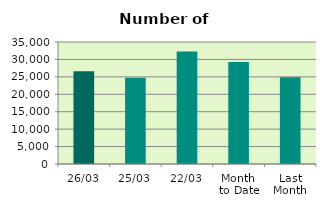
| Category | Series 0 |
|---|---|
| 26/03 | 26638 |
| 25/03 | 24738 |
| 22/03 | 32302 |
| Month 
to Date | 29226.778 |
| Last
Month | 24872.2 |